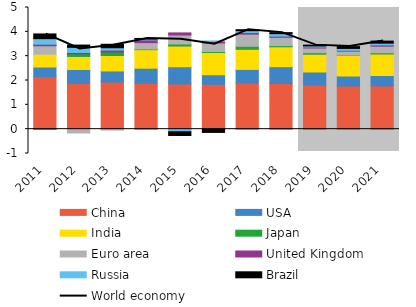
| Category | China | USA | India | Japan | Euro area | United Kingdom | Russia | Brazil |
|---|---|---|---|---|---|---|---|---|
| 2011.0 | 2.158 | 0.395 | 0.527 | -0.009 | 0.349 | 0.063 | 0.228 | 0.194 |
| 2012.0 | 1.886 | 0.566 | 0.536 | 0.11 | -0.157 | 0.054 | 0.212 | 0.092 |
| 2013.0 | 1.938 | 0.455 | 0.636 | 0.146 | -0.039 | 0.076 | 0.096 | 0.143 |
| 2014.0 | 1.888 | 0.618 | 0.761 | 0.026 | 0.264 | 0.109 | 0.04 | 0.023 |
| 2015.0 | 1.859 | 0.707 | 0.85 | 0.084 | 0.37 | 0.086 | -0.107 | -0.153 |
| 2016.0 | 1.845 | 0.392 | 0.914 | 0.041 | 0.352 | 0.064 | 0.015 | -0.133 |
| 2017.0 | 1.896 | 0.558 | 0.827 | 0.124 | 0.499 | 0.065 | 0.076 | 0.042 |
| 2018.0 | 1.88 | 0.689 | 0.816 | 0.049 | 0.342 | 0.048 | 0.101 | 0.043 |
| 2019.0 | 1.814 | 0.536 | 0.731 | 0.061 | 0.194 | 0.041 | 0.045 | 0.034 |
| 2020.0 | 1.773 | 0.411 | 0.855 | 0.012 | 0.155 | 0.033 | 0.079 | 0.074 |
| 2021.0 | 1.778 | 0.428 | 0.881 | 0.052 | 0.271 | 0.052 | 0.073 | 0.084 |